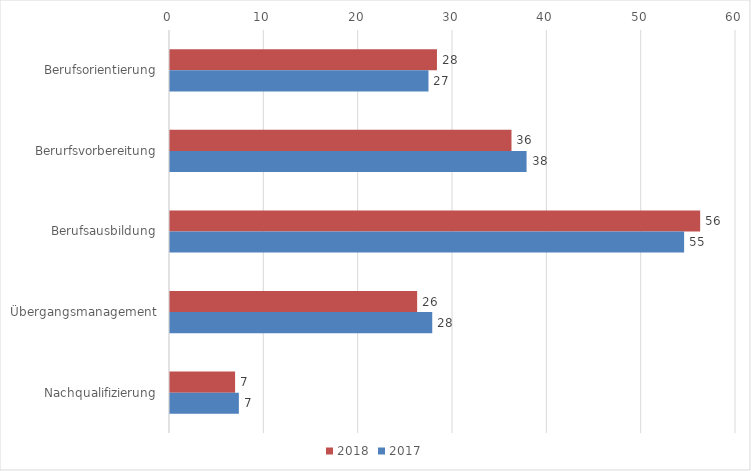
| Category | 2018 | 2017 |
|---|---|---|
| Berufsorientierung | 28.3 | 27.4 |
| Berurfsvorbereitung | 36.2 | 37.8 |
| Berufsausbildung | 56.2 | 54.5 |
| Übergangsmanagement | 26.2 | 27.8 |
| Nachqualifizierung | 6.9 | 7.3 |